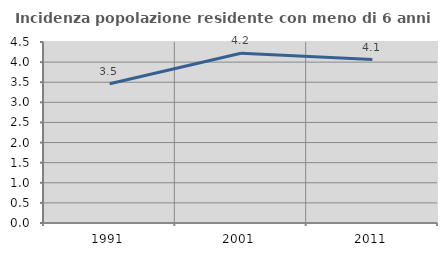
| Category | Incidenza popolazione residente con meno di 6 anni |
|---|---|
| 1991.0 | 3.461 |
| 2001.0 | 4.221 |
| 2011.0 | 4.064 |